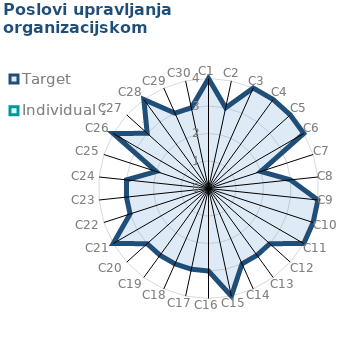
| Category | Target | Individual 2 |
|---|---|---|
| C1 | 4 | 0 |
| C2 | 3 | 0 |
| C3 | 4 | 0 |
| C4 | 4 | 0 |
| C5 | 4 | 0 |
| C6 | 4 | 0 |
| C7 | 2 | 0 |
| C8 | 3 | 0 |
| C9 | 4 | 0 |
| C10 | 4 | 0 |
| C11 | 4 | 0 |
| C12 | 3 | 0 |
| C13 | 3 | 0 |
| C14 | 3 | 0 |
| C15 | 4 | 0 |
| C16 | 3 | 0 |
| C17 | 3 | 0 |
| C18 | 3 | 0 |
| C19 | 3 | 0 |
| C20 | 3 | 0 |
| C21 | 4 | 0 |
| C22 | 3 | 0 |
| C23 | 3 | 0 |
| C24 | 3 | 0 |
| C25 | 2 | 0 |
| C26 | 4 | 0 |
| C27 | 3 | 0 |
| C28 | 4 | 0 |
| C29 | 3 | 0 |
| C30 | 3 | 0 |